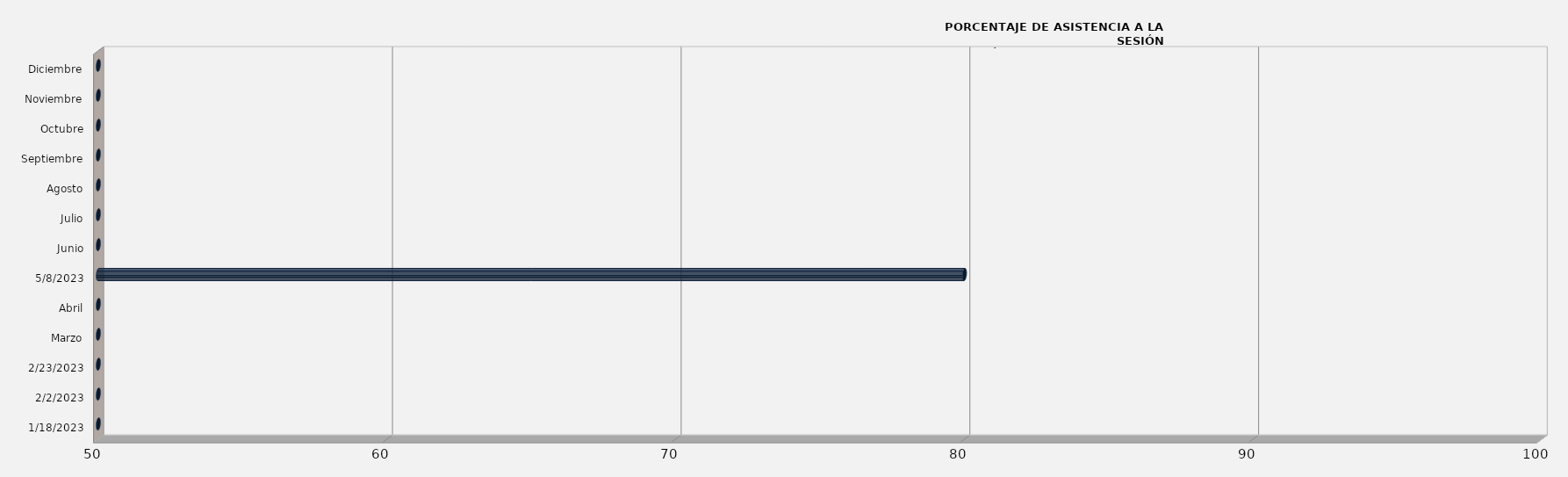
| Category | Series 0 |
|---|---|
| 18/01/2023 | 0 |
| 02/02/2023 | 0 |
| 23/02/2023 | 0 |
| Marzo | 0 |
| Abril | 0 |
| 08/05/2023 | 80 |
| Junio | 0 |
| Julio | 0 |
| Agosto | 0 |
| Septiembre | 0 |
| Octubre | 0 |
| Noviembre | 0 |
| Diciembre | 0 |